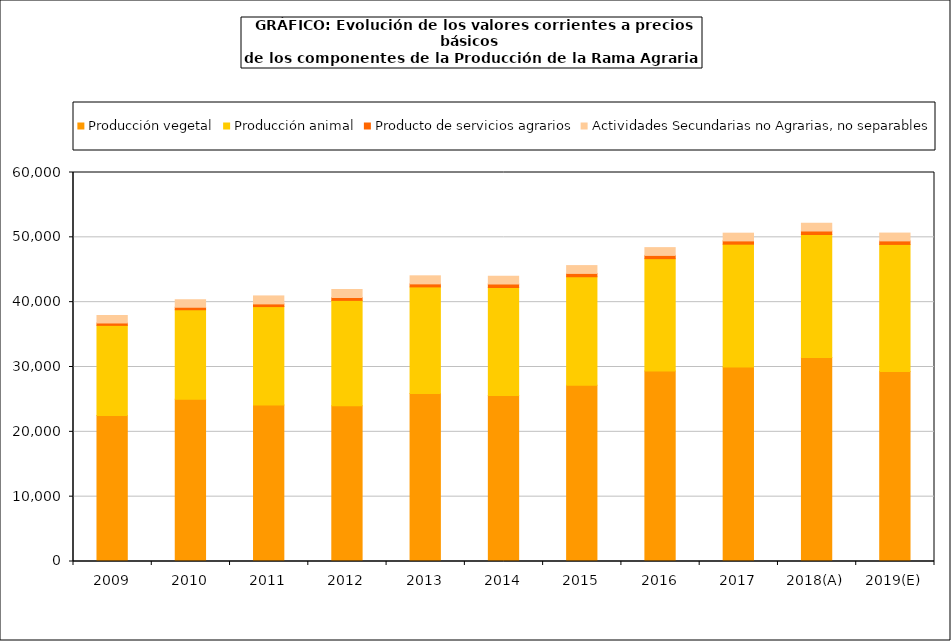
| Category | Producción vegetal | Producción animal | Producto de servicios agrarios | Actividades Secundarias no Agrarias, no separables |
|---|---|---|---|---|
| 2009 | 22510 | 13911.4 | 367.9 | 1156.5 |
| 2010 | 25028.1 | 13797.4 | 389.6 | 1156.1 |
| 2011 | 24157.4 | 15160 | 415.1 | 1231.2 |
| 2012 | 24030.3 | 16245.1 | 442.5 | 1236.6 |
| 2013 | 25895.9 | 16457.7 | 468.7 | 1242.3 |
| 2014 | 25585 | 16681.5 | 520.2 | 1207.1 |
| 2015 | 27192.2 | 16727.3 | 514.9 | 1207.6 |
| 2016 | 29398.1 | 17310.6 | 503.7 | 1199.2 |
| 2017 | 29981.4 | 18962 | 506.1 | 1191.3 |
| 2018(A) | 31483 | 18954.9 | 528.6 | 1191.2 |
| 2019(E) | 29310.4 | 19597.3 | 543.7 | 1205.5 |